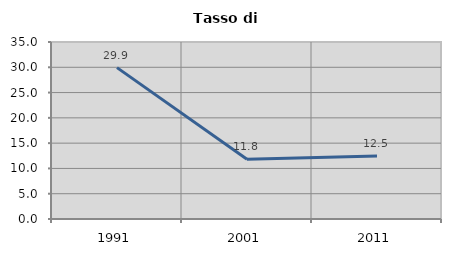
| Category | Tasso di disoccupazione   |
|---|---|
| 1991.0 | 29.928 |
| 2001.0 | 11.804 |
| 2011.0 | 12.45 |